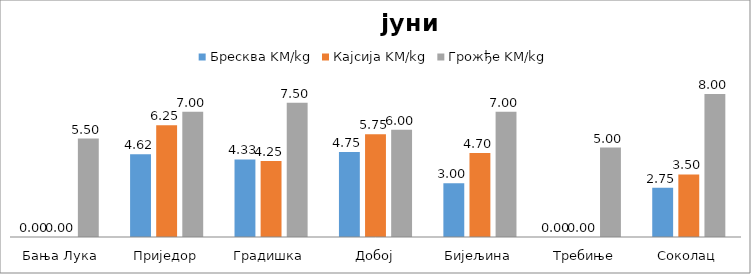
| Category | Бресква | Кајсија | Грожђе |
|---|---|---|---|
| Бања Лука | 0 | 0 | 5.5 |
| Приједор | 4.62 | 6.25 | 7 |
| Градишка | 4.333 | 4.25 | 7.5 |
| Добој | 4.75 | 5.75 | 6 |
| Бијељина | 3 | 4.7 | 7 |
|  Требиње | 0 | 0 | 5 |
| Соколац | 2.75 | 3.5 | 8 |